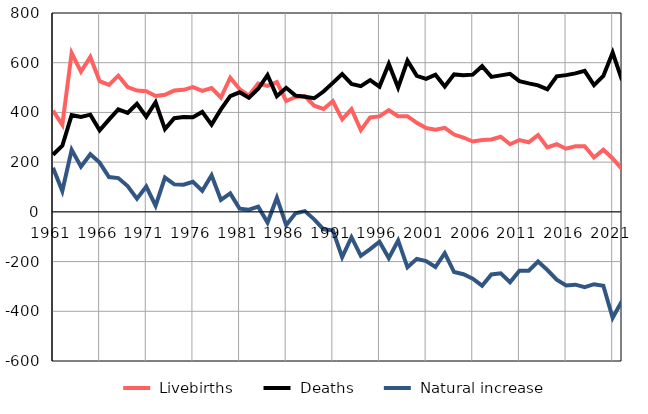
| Category |  Livebirths |  Deaths |  Natural increase |
|---|---|---|---|
| 1961.0 | 407 | 230 | 177 |
| 1962.0 | 350 | 266 | 84 |
| 1963.0 | 639 | 389 | 250 |
| 1964.0 | 564 | 382 | 182 |
| 1965.0 | 623 | 391 | 232 |
| 1966.0 | 526 | 328 | 198 |
| 1967.0 | 511 | 371 | 140 |
| 1968.0 | 548 | 412 | 136 |
| 1969.0 | 502 | 398 | 104 |
| 1970.0 | 488 | 435 | 53 |
| 1971.0 | 485 | 383 | 102 |
| 1972.0 | 466 | 441 | 25 |
| 1973.0 | 471 | 333 | 138 |
| 1974.0 | 488 | 377 | 111 |
| 1975.0 | 491 | 382 | 109 |
| 1976.0 | 502 | 381 | 121 |
| 1977.0 | 487 | 402 | 85 |
| 1978.0 | 498 | 351 | 147 |
| 1979.0 | 460 | 412 | 48 |
| 1980.0 | 540 | 466 | 74 |
| 1981.0 | 494 | 481 | 13 |
| 1982.0 | 468 | 459 | 9 |
| 1983.0 | 516 | 495 | 21 |
| 1984.0 | 507 | 550 | -43 |
| 1985.0 | 522 | 465 | 57 |
| 1986.0 | 446 | 499 | -53 |
| 1987.0 | 462 | 468 | -6 |
| 1988.0 | 466 | 463 | 3 |
| 1989.0 | 427 | 457 | -30 |
| 1990.0 | 414 | 484 | -70 |
| 1991.0 | 445 | 519 | -74 |
| 1992.0 | 372 | 554 | -182 |
| 1993.0 | 413 | 515 | -102 |
| 1994.0 | 329 | 506 | -177 |
| 1995.0 | 380 | 530 | -150 |
| 1996.0 | 384 | 504 | -120 |
| 1997.0 | 409 | 595 | -186 |
| 1998.0 | 385 | 500 | -115 |
| 1999.0 | 385 | 608 | -223 |
| 2000.0 | 358 | 547 | -189 |
| 2001.0 | 337 | 535 | -198 |
| 2002.0 | 330 | 552 | -222 |
| 2003.0 | 338 | 504 | -166 |
| 2004.0 | 311 | 553 | -242 |
| 2005.0 | 299 | 550 | -251 |
| 2006.0 | 283 | 552 | -269 |
| 2007.0 | 289 | 586 | -297 |
| 2008.0 | 291 | 543 | -252 |
| 2009.0 | 302 | 549 | -247 |
| 2010.0 | 272 | 555 | -283 |
| 2011.0 | 289 | 526 | -237 |
| 2012.0 | 280 | 517 | -237 |
| 2013.0 | 309 | 509 | -200 |
| 2014.0 | 259 | 493 | -234 |
| 2015.0 | 272 | 545 | -273 |
| 2016.0 | 254 | 550 | -296 |
| 2017.0 | 264 | 557 | -293 |
| 2018.0 | 264 | 567 | -303 |
| 2019.0 | 219 | 510 | -291 |
| 2020.0 | 250 | 547 | -297 |
| 2021.0 | 215 | 641 | -426 |
| 2022.0 | 172 | 530 | -358 |